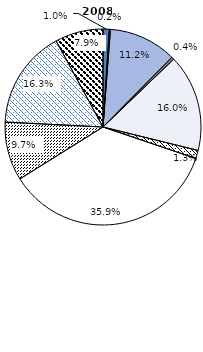
| Category | 2008 |
|---|---|
| Huile/graisse/cire animale/végétale | 1.026 |
| Boissons et tabac | 0.184 |
| Produits chimiques | 11.199 |
| Produits de base | 0.421 |
| Matières premières (hors alimentation et carburants) | 16.019 |
| Alimentation et bétail | 1.349 |
| Machineries et équipements de transport | 35.916 |
| Produits manufacturés | 9.681 |
| Carburants minéraux et lubrifiants | 16.271 |
| Articles manufacturés divers | 7.934 |